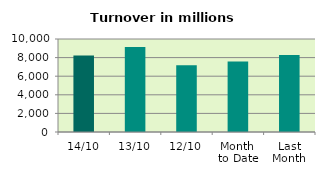
| Category | Series 0 |
|---|---|
| 14/10 | 8223.648 |
| 13/10 | 9153.102 |
| 12/10 | 7190.421 |
| Month 
to Date | 7579.993 |
| Last
Month | 8284.199 |